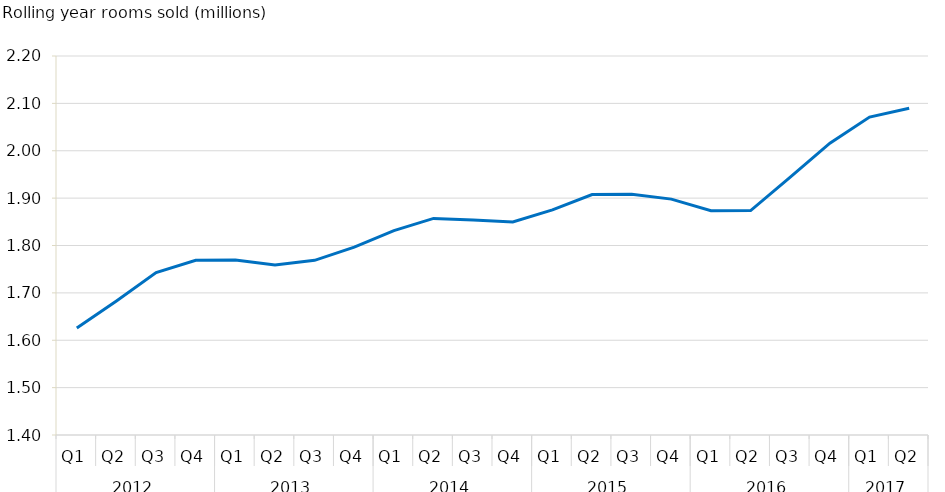
| Category | Series 0 |
|---|---|
| 0 | 1625798.175 |
| 1 | 1682986.282 |
| 2 | 1742794.791 |
| 3 | 1768685.123 |
| 4 | 1769588.225 |
| 5 | 1758950.115 |
| 6 | 1768672.827 |
| 7 | 1796703.317 |
| 8 | 1831335.384 |
| 9 | 1857225.461 |
| 10 | 1854028.286 |
| 11 | 1849521.422 |
| 12 | 1875195.63 |
| 13 | 1907646.356 |
| 14 | 1907929.166 |
| 15 | 1897876.32 |
| 16 | 1873411.233 |
| 17 | 1873676.965 |
| 18 | 1944377.589 |
| 19 | 2016024.39 |
| 20 | 2071104.899 |
| 21 | 2089776.154 |